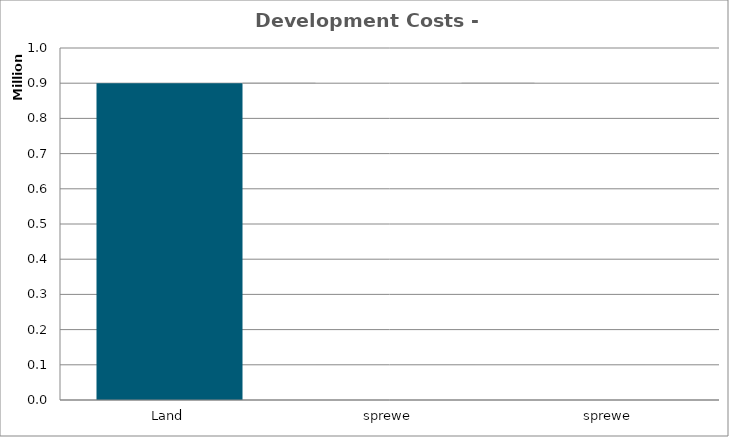
| Category | Property Value | Debt |
|---|---|---|
| 1.0 | 7.5 | 5.4 |
| 2.0 | 7.7 | 5.3 |
| 3.0 | 8 | 5.2 |
| 4.0 | 8.2 | 5.1 |
| 5.0 | 8.5 | 5 |
| 6.0 | 8.7 | 4.8 |
| 7.0 | 9 | 4.7 |
| 8.0 | 9.2 | 4.6 |
| 9.0 | 9.5 | 4.4 |
| 10.0 | 9.8 | 4.2 |
| 15.0 | 11.4 | 3.2 |
| 25.0 | 15.3 | 0 |